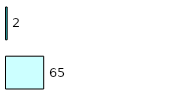
| Category | Series 0 | Series 1 |
|---|---|---|
| 0 | 65 | 2 |